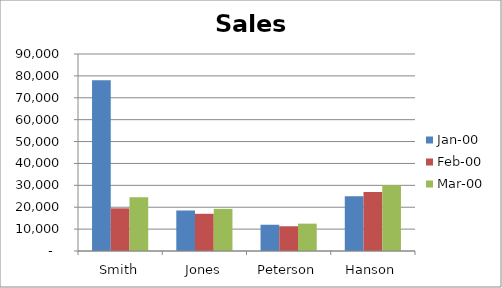
| Category | Jan-00 | Feb-00 | Mar-00 |
|---|---|---|---|
| Smith | 78000 | 19500 | 24500 |
| Jones | 18500 | 17000 | 19250 |
| Peterson | 12000 | 11300 | 12500 |
| Hanson | 25000 | 27000 | 30000 |